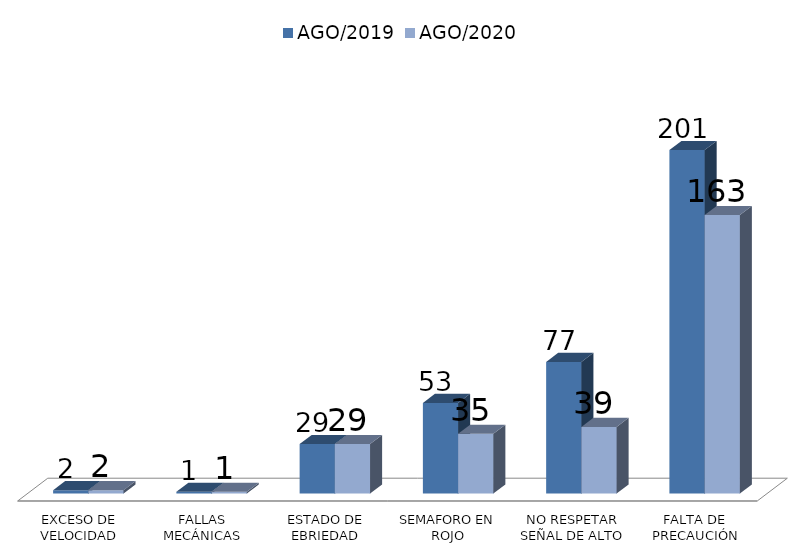
| Category | AGO/2019 | AGO/2020 |
|---|---|---|
| EXCESO DE VELOCIDAD | 2 | 2 |
| FALLAS MECÁNICAS | 1 | 1 |
| ESTADO DE EBRIEDAD | 29 | 29 |
| SEMAFORO EN ROJO | 53 | 35 |
| NO RESPETAR SEÑAL DE ALTO | 77 | 39 |
| FALTA DE PRECAUCIÓN | 201 | 163 |